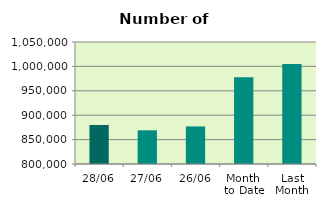
| Category | Series 0 |
|---|---|
| 28/06 | 879978 |
| 27/06 | 869046 |
| 26/06 | 876986 |
| Month 
to Date | 977938.2 |
| Last
Month | 1004730.273 |